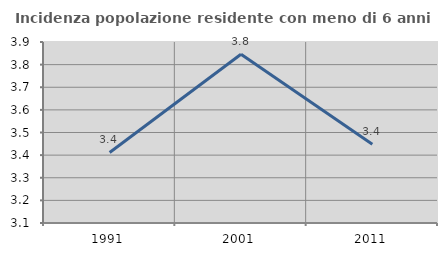
| Category | Incidenza popolazione residente con meno di 6 anni |
|---|---|
| 1991.0 | 3.412 |
| 2001.0 | 3.846 |
| 2011.0 | 3.448 |